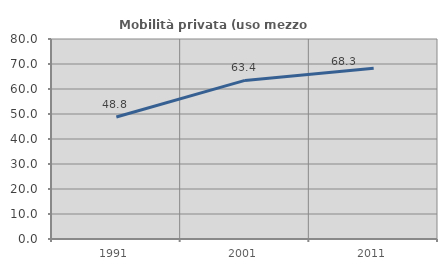
| Category | Mobilità privata (uso mezzo privato) |
|---|---|
| 1991.0 | 48.8 |
| 2001.0 | 63.441 |
| 2011.0 | 68.302 |